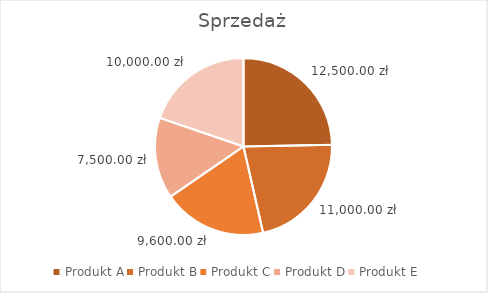
| Category | Sprzedaż |
|---|---|
| Produkt A | 12500 |
| Produkt B | 11000 |
| Produkt C | 9600 |
| Produkt D | 7500 |
| Produkt E | 10000 |